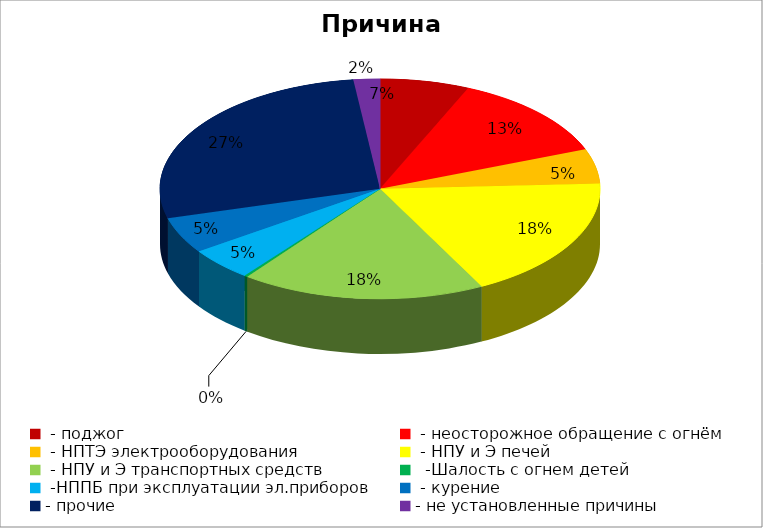
| Category | Причина пожара |
|---|---|
|  - поджог | 27 |
|  - неосторожное обращение с огнём | 52 |
|  - НПТЭ электрооборудования | 21 |
|  - НПУ и Э печей | 75 |
|  - НПУ и Э транспортных средств | 74 |
|   -Шалость с огнем детей | 1 |
|  -НППБ при эксплуатации эл.приборов | 20 |
|  - курение | 22 |
| - прочие | 113 |
| - не установленные причины | 8 |